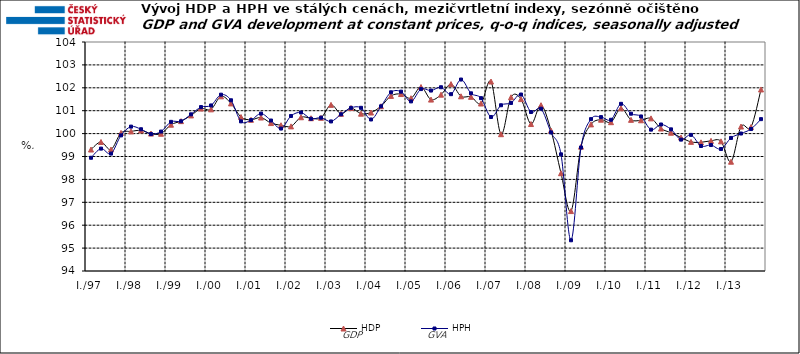
| Category | HDP

 | HPH

 |
|---|---|---|
| I./97 | 99.304 | 98.944 |
|  | 99.634 | 99.344 |
|  | 99.305 | 99.127 |
|  | 100.029 | 99.922 |
| I./98 | 100.096 | 100.305 |
|  | 100.14 | 100.19 |
|  | 100.001 | 99.98 |
|  | 99.994 | 100.089 |
| I./99 | 100.389 | 100.513 |
|  | 100.545 | 100.539 |
|  | 100.793 | 100.842 |
|  | 101.094 | 101.158 |
| I./00 | 101.059 | 101.229 |
|  | 101.627 | 101.7 |
|  | 101.318 | 101.455 |
|  | 100.723 | 100.534 |
| I./01 | 100.603 | 100.591 |
|  | 100.702 | 100.873 |
|  | 100.46 | 100.571 |
|  | 100.365 | 100.22 |
| I./02 | 100.315 | 100.77 |
|  | 100.715 | 100.922 |
|  | 100.671 | 100.647 |
|  | 100.689 | 100.695 |
| I./03 | 101.255 | 100.531 |
|  | 100.863 | 100.843 |
|  | 101.117 | 101.123 |
|  | 100.87 | 101.126 |
| I./04 | 100.921 | 100.617 |
|  | 101.194 | 101.191 |
|  | 101.647 | 101.804 |
|  | 101.727 | 101.831 |
| I./05 | 101.545 | 101.406 |
|  | 102.034 | 101.945 |
|  | 101.486 | 101.88 |
|  | 101.701 | 102.024 |
| I./06 | 102.162 | 101.722 |
|  | 101.63 | 102.361 |
|  | 101.606 | 101.759 |
|  | 101.313 | 101.548 |
| I./07 | 102.275 | 100.725 |
|  | 99.974 | 101.238 |
|  | 101.587 | 101.338 |
|  | 101.507 | 101.707 |
| I./08 | 100.418 | 100.942 |
|  | 101.241 | 101.088 |
|  | 100.133 | 100.051 |
|  | 98.27 | 99.095 |
| I./09 | 96.617 | 95.342 |
|  | 99.43 | 99.393 |
|  | 100.402 | 100.632 |
|  | 100.608 | 100.721 |
| I./10 | 100.499 | 100.603 |
|  | 101.105 | 101.3 |
|  | 100.601 | 100.869 |
|  | 100.582 | 100.749 |
| I./11 | 100.665 | 100.173 |
|  | 100.22 | 100.398 |
|  | 100.038 | 100.185 |
|  | 99.83 | 99.737 |
| I./12 | 99.639 | 99.944 |
|  | 99.62 | 99.458 |
|  | 99.684 | 99.501 |
|  | 99.662 | 99.328 |
| I./13 | 98.773 | 99.811 |